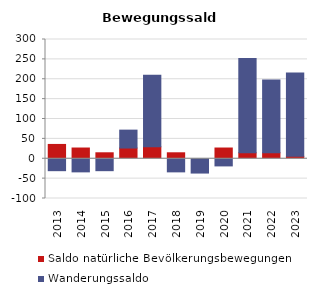
| Category | Saldo natürliche Bevölkerungsbewegungen | Wanderungssaldo |
|---|---|---|
| 2013.0 | 36 | -30 |
| 2014.0 | 27 | -33 |
| 2015.0 | 15 | -30 |
| 2016.0 | 27 | 45 |
| 2017.0 | 30 | 180 |
| 2018.0 | 15 | -33 |
| 2019.0 | 0 | -36 |
| 2020.0 | 27 | -18 |
| 2021.0 | 15 | 237 |
| 2022.0 | 15 | 183 |
| 2023.0 | 6 | 210 |